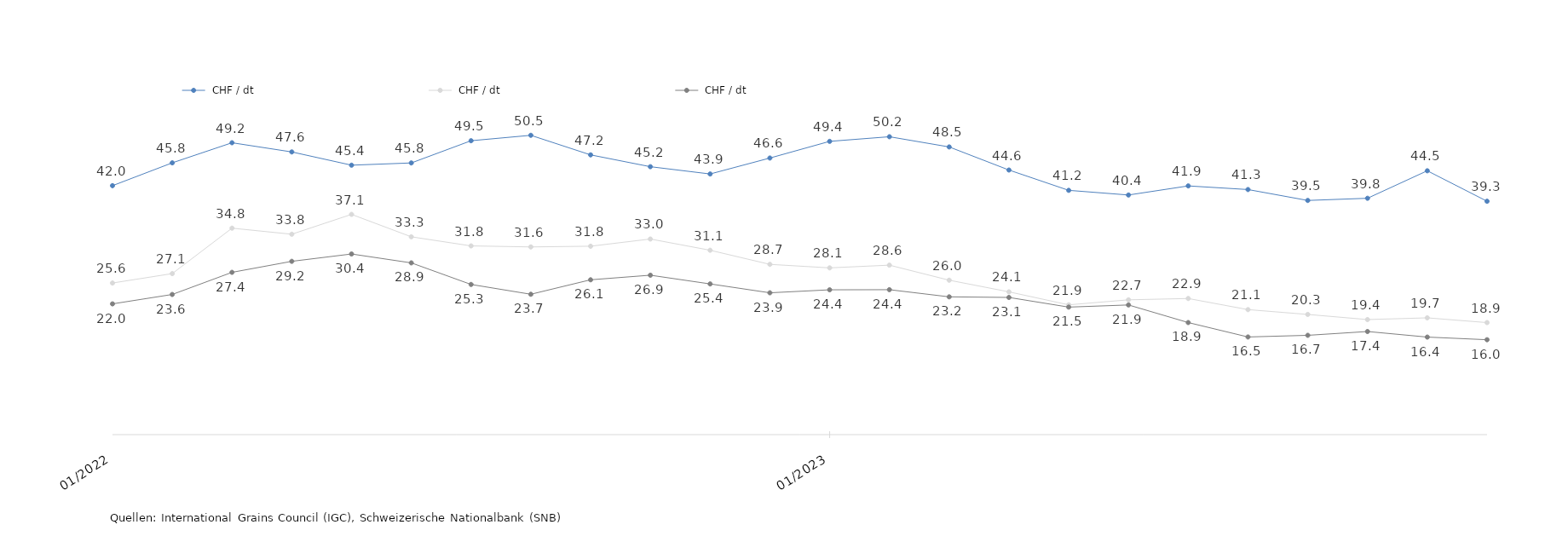
| Category | Sojaschrot CBOT | Körnermais MATIF | Körnermais CBOT |
|---|---|---|---|
| 2022-01-01 | 41.961 | 25.555 | 22.039 |
| 2022-02-01 | 45.811 | 27.141 | 23.624 |
| 2022-03-01 | 49.198 | 34.8 | 27.355 |
| 2022-04-01 | 47.65 | 33.78 | 29.21 |
| 2022-05-01 | 45.418 | 37.124 | 30.448 |
| 2022-06-01 | 45.794 | 33.343 | 28.95 |
| 2022-07-01 | 49.539 | 31.812 | 25.312 |
| 2022-08-01 | 50.453 | 31.636 | 23.659 |
| 2022-09-01 | 47.153 | 31.758 | 26.1 |
| 2022-10-01 | 45.159 | 32.97 | 26.871 |
| 2022-11-01 | 43.933 | 31.078 | 25.401 |
| 2022-12-01 | 46.622 | 28.699 | 23.908 |
| 2023-01-01 | 49.433 | 28.11 | 24.41 |
| 2023-02-01 | 50.212 | 28.566 | 24.431 |
| 2023-03-01 | 48.493 | 26.031 | 23.224 |
| 2023-04-01 | 44.6 | 24.066 | 23.123 |
| 2023-05-01 | 41.177 | 21.877 | 21.495 |
| 2023-06-01 | 40.39 | 22.722 | 21.857 |
| 2023-07-01 | 41.922 | 22.945 | 18.891 |
| 2023-08-01 | 41.311 | 21.072 | 16.459 |
| 2023-09-01 | 39.472 | 20.26 | 16.739 |
| 2023-10-01 | 39.84 | 19.392 | 17.38 |
| 2023-11-01 | 44.475 | 19.683 | 16.442 |
| 2023-12-01 | 39.339 | 18.884 | 15.995 |